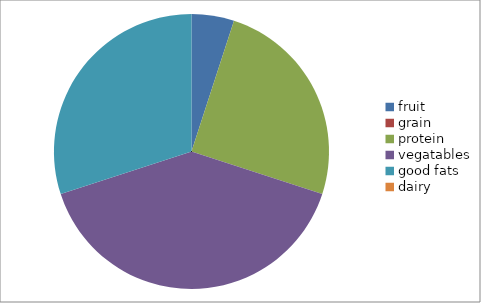
| Category | Series 0 |
|---|---|
| fruit | 5 |
| grain | 0 |
| protein | 25 |
| vegatables | 40 |
| good fats | 30 |
| dairy | 0 |